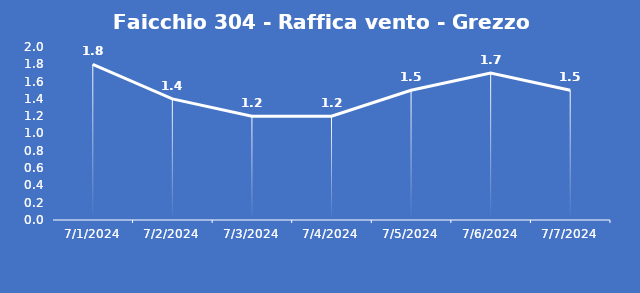
| Category | Faicchio 304 - Raffica vento - Grezzo (m/s) |
|---|---|
| 7/1/24 | 1.8 |
| 7/2/24 | 1.4 |
| 7/3/24 | 1.2 |
| 7/4/24 | 1.2 |
| 7/5/24 | 1.5 |
| 7/6/24 | 1.7 |
| 7/7/24 | 1.5 |